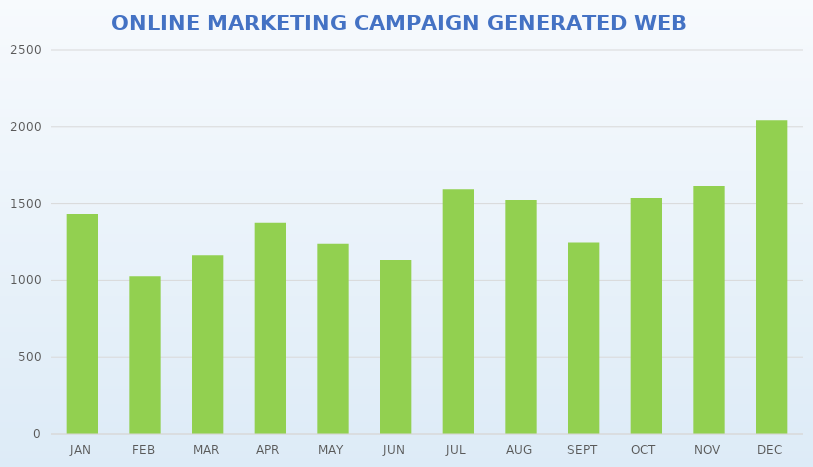
| Category | Series 0 |
|---|---|
| JAN | 1432 |
| FEB | 1027 |
| MAR | 1163 |
| APR | 1375 |
| MAY | 1239 |
| JUN | 1132 |
| JUL | 1593 |
| AUG | 1523 |
| SEPT | 1246 |
| OCT | 1537 |
| NOV | 1614 |
| DEC | 2043 |